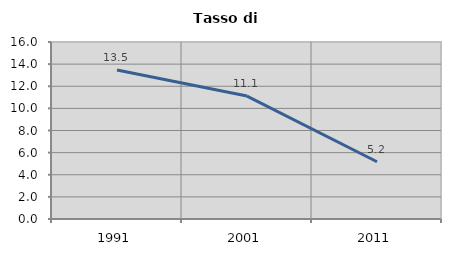
| Category | Tasso di disoccupazione   |
|---|---|
| 1991.0 | 13.462 |
| 2001.0 | 11.111 |
| 2011.0 | 5.172 |